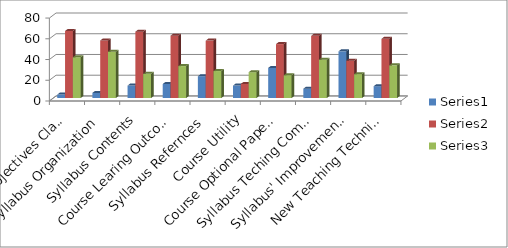
| Category | Series 0 | Series 1 | Series 2 |
|---|---|---|---|
| Course Objectives Clarity | 3.33 | 64.66 | 39.33 |
| Syllabus Organization | 4.9 | 55.5 | 44.63 |
| Syllabus Contents | 12 | 64 | 23.33 |
| Course Learing Outcomes | 13.5 | 60.11 | 30.78 |
| Syllabus Refernces  | 21 | 55.36 | 26 |
| Course Utility | 12 | 13.6 | 24.9 |
| Course Optional Papers | 29 | 52 | 21.99 |
| Syllabus Teching Compatibility  | 9 | 60 | 36.98 |
| Syllabus' Improvement Scope | 45 | 36 | 23 |
| New Teaching Techniques | 11.4 | 57.1 | 31.5 |